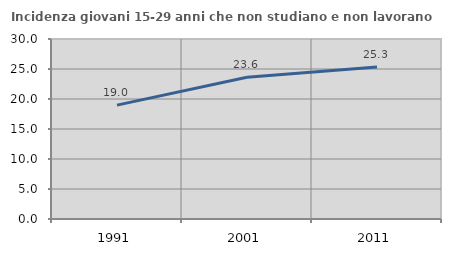
| Category | Incidenza giovani 15-29 anni che non studiano e non lavorano  |
|---|---|
| 1991.0 | 18.975 |
| 2001.0 | 23.611 |
| 2011.0 | 25.316 |